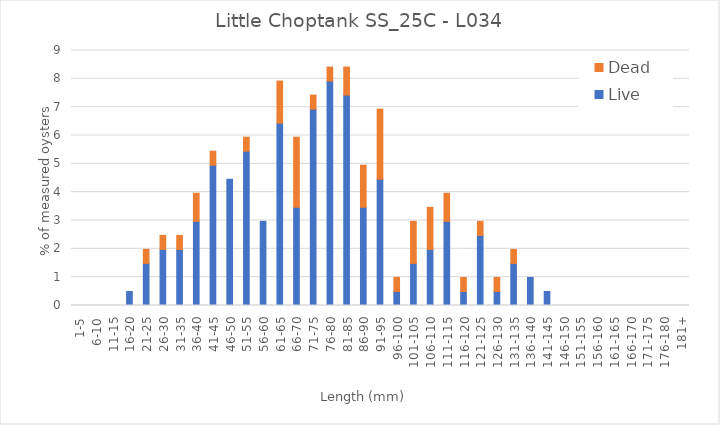
| Category | Live | Dead |
|---|---|---|
| 1-5 | 0 | 0 |
| 6-10 | 0 | 0 |
| 11-15 | 0 | 0 |
| 16-20 | 0.495 | 0 |
| 21-25 | 1.485 | 0.495 |
| 26-30 | 1.98 | 0.495 |
| 31-35 | 1.98 | 0.495 |
| 36-40 | 2.97 | 0.99 |
| 41-45 | 4.95 | 0.495 |
| 46-50 | 4.455 | 0 |
| 51-55 | 5.446 | 0.495 |
| 56-60 | 2.97 | 0 |
| 61-65 | 6.436 | 1.485 |
| 66-70 | 3.465 | 2.475 |
| 71-75 | 6.931 | 0.495 |
| 76-80 | 7.921 | 0.495 |
| 81-85 | 7.426 | 0.99 |
| 86-90 | 3.465 | 1.485 |
| 91-95 | 4.455 | 2.475 |
| 96-100 | 0.495 | 0.495 |
| 101-105 | 1.485 | 1.485 |
| 106-110 | 1.98 | 1.485 |
| 111-115 | 2.97 | 0.99 |
| 116-120 | 0.495 | 0.495 |
| 121-125 | 2.475 | 0.495 |
| 126-130 | 0.495 | 0.495 |
| 131-135 | 1.485 | 0.495 |
| 136-140 | 0.99 | 0 |
| 141-145 | 0.495 | 0 |
| 146-150 | 0 | 0 |
| 151-155 | 0 | 0 |
| 156-160 | 0 | 0 |
| 161-165 | 0 | 0 |
| 166-170 | 0 | 0 |
| 171-175 | 0 | 0 |
| 176-180 | 0 | 0 |
| 181+ | 0 | 0 |